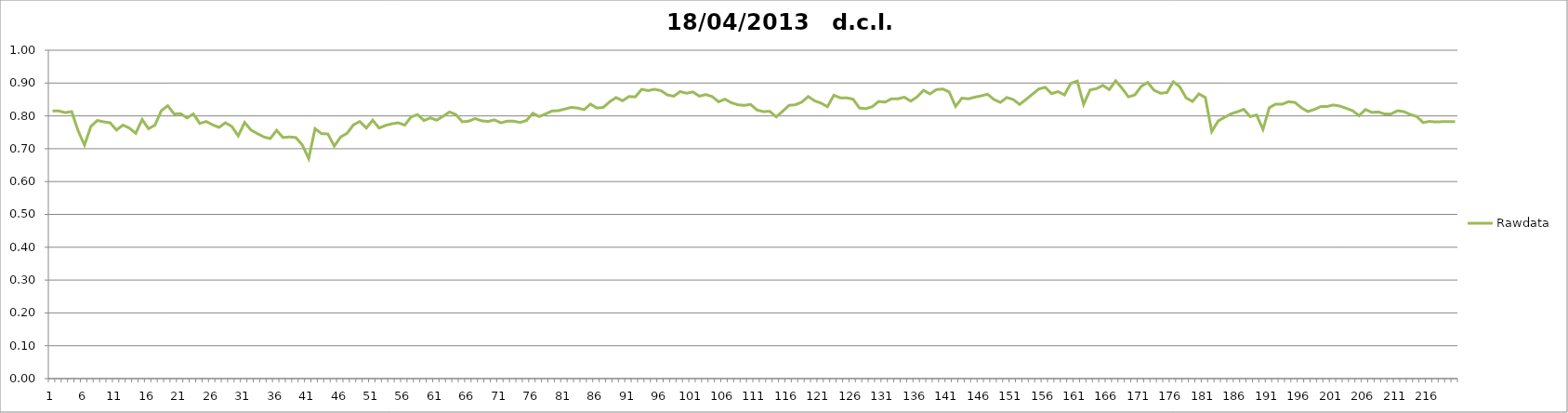
| Category | Rawdata |
|---|---|
| 0 | 0.815 |
| 1 | 0.815 |
| 2 | 0.81 |
| 3 | 0.813 |
| 4 | 0.755 |
| 5 | 0.711 |
| 6 | 0.768 |
| 7 | 0.786 |
| 8 | 0.782 |
| 9 | 0.779 |
| 10 | 0.757 |
| 11 | 0.772 |
| 12 | 0.763 |
| 13 | 0.747 |
| 14 | 0.789 |
| 15 | 0.761 |
| 16 | 0.772 |
| 17 | 0.816 |
| 18 | 0.831 |
| 19 | 0.806 |
| 20 | 0.807 |
| 21 | 0.794 |
| 22 | 0.806 |
| 23 | 0.777 |
| 24 | 0.783 |
| 25 | 0.773 |
| 26 | 0.765 |
| 27 | 0.779 |
| 28 | 0.768 |
| 29 | 0.739 |
| 30 | 0.78 |
| 31 | 0.757 |
| 32 | 0.746 |
| 33 | 0.736 |
| 34 | 0.731 |
| 35 | 0.756 |
| 36 | 0.734 |
| 37 | 0.736 |
| 38 | 0.734 |
| 39 | 0.712 |
| 40 | 0.67 |
| 41 | 0.761 |
| 42 | 0.746 |
| 43 | 0.745 |
| 44 | 0.708 |
| 45 | 0.736 |
| 46 | 0.747 |
| 47 | 0.773 |
| 48 | 0.783 |
| 49 | 0.763 |
| 50 | 0.787 |
| 51 | 0.763 |
| 52 | 0.771 |
| 53 | 0.776 |
| 54 | 0.779 |
| 55 | 0.772 |
| 56 | 0.797 |
| 57 | 0.804 |
| 58 | 0.786 |
| 59 | 0.794 |
| 60 | 0.787 |
| 61 | 0.799 |
| 62 | 0.812 |
| 63 | 0.804 |
| 64 | 0.782 |
| 65 | 0.784 |
| 66 | 0.792 |
| 67 | 0.785 |
| 68 | 0.783 |
| 69 | 0.788 |
| 70 | 0.779 |
| 71 | 0.784 |
| 72 | 0.784 |
| 73 | 0.78 |
| 74 | 0.786 |
| 75 | 0.808 |
| 76 | 0.798 |
| 77 | 0.806 |
| 78 | 0.815 |
| 79 | 0.816 |
| 80 | 0.821 |
| 81 | 0.826 |
| 82 | 0.824 |
| 83 | 0.819 |
| 84 | 0.836 |
| 85 | 0.824 |
| 86 | 0.826 |
| 87 | 0.843 |
| 88 | 0.856 |
| 89 | 0.846 |
| 90 | 0.859 |
| 91 | 0.858 |
| 92 | 0.881 |
| 93 | 0.877 |
| 94 | 0.881 |
| 95 | 0.877 |
| 96 | 0.864 |
| 97 | 0.86 |
| 98 | 0.874 |
| 99 | 0.869 |
| 100 | 0.873 |
| 101 | 0.86 |
| 102 | 0.865 |
| 103 | 0.859 |
| 104 | 0.843 |
| 105 | 0.851 |
| 106 | 0.84 |
| 107 | 0.834 |
| 108 | 0.832 |
| 109 | 0.835 |
| 110 | 0.818 |
| 111 | 0.813 |
| 112 | 0.814 |
| 113 | 0.797 |
| 114 | 0.814 |
| 115 | 0.832 |
| 116 | 0.834 |
| 117 | 0.842 |
| 118 | 0.859 |
| 119 | 0.846 |
| 120 | 0.839 |
| 121 | 0.828 |
| 122 | 0.863 |
| 123 | 0.855 |
| 124 | 0.855 |
| 125 | 0.851 |
| 126 | 0.824 |
| 127 | 0.822 |
| 128 | 0.828 |
| 129 | 0.844 |
| 130 | 0.842 |
| 131 | 0.852 |
| 132 | 0.852 |
| 133 | 0.857 |
| 134 | 0.845 |
| 135 | 0.858 |
| 136 | 0.878 |
| 137 | 0.867 |
| 138 | 0.88 |
| 139 | 0.882 |
| 140 | 0.873 |
| 141 | 0.829 |
| 142 | 0.854 |
| 143 | 0.852 |
| 144 | 0.857 |
| 145 | 0.861 |
| 146 | 0.866 |
| 147 | 0.85 |
| 148 | 0.841 |
| 149 | 0.856 |
| 150 | 0.85 |
| 151 | 0.835 |
| 152 | 0.85 |
| 153 | 0.866 |
| 154 | 0.882 |
| 155 | 0.887 |
| 156 | 0.868 |
| 157 | 0.874 |
| 158 | 0.864 |
| 159 | 0.899 |
| 160 | 0.906 |
| 161 | 0.835 |
| 162 | 0.879 |
| 163 | 0.883 |
| 164 | 0.893 |
| 165 | 0.88 |
| 166 | 0.907 |
| 167 | 0.884 |
| 168 | 0.858 |
| 169 | 0.864 |
| 170 | 0.89 |
| 171 | 0.902 |
| 172 | 0.878 |
| 173 | 0.869 |
| 174 | 0.871 |
| 175 | 0.904 |
| 176 | 0.889 |
| 177 | 0.855 |
| 178 | 0.844 |
| 179 | 0.867 |
| 180 | 0.856 |
| 181 | 0.752 |
| 182 | 0.785 |
| 183 | 0.796 |
| 184 | 0.806 |
| 185 | 0.813 |
| 186 | 0.82 |
| 187 | 0.798 |
| 188 | 0.803 |
| 189 | 0.759 |
| 190 | 0.825 |
| 191 | 0.836 |
| 192 | 0.836 |
| 193 | 0.843 |
| 194 | 0.841 |
| 195 | 0.825 |
| 196 | 0.813 |
| 197 | 0.82 |
| 198 | 0.828 |
| 199 | 0.829 |
| 200 | 0.833 |
| 201 | 0.83 |
| 202 | 0.823 |
| 203 | 0.816 |
| 204 | 0.801 |
| 205 | 0.82 |
| 206 | 0.811 |
| 207 | 0.812 |
| 208 | 0.806 |
| 209 | 0.806 |
| 210 | 0.816 |
| 211 | 0.813 |
| 212 | 0.804 |
| 213 | 0.798 |
| 214 | 0.78 |
| 215 | 0.783 |
| 216 | 0.782 |
| 217 | 0.783 |
| 218 | 0.783 |
| 219 | 0.783 |